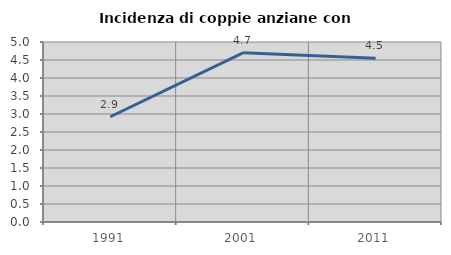
| Category | Incidenza di coppie anziane con figli |
|---|---|
| 1991.0 | 2.924 |
| 2001.0 | 4.698 |
| 2011.0 | 4.545 |